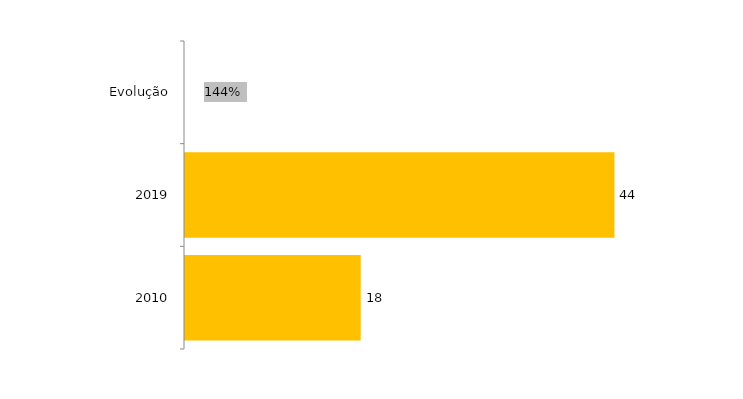
| Category | Evolução Vagas Ofertadas |
|---|---|
| 2010 | 18 |
| 2019 | 44 |
| Evolução | 1.444 |